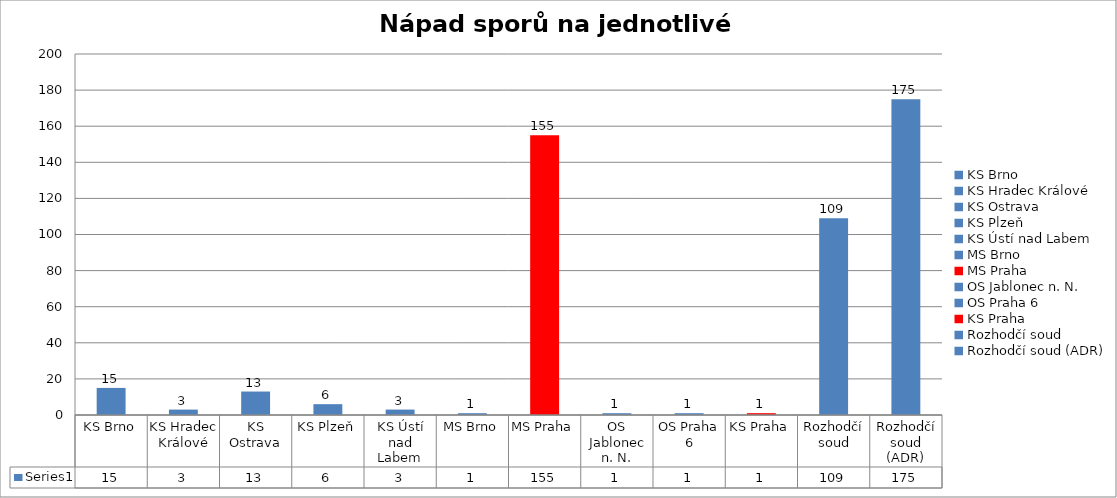
| Category | Series 0 |
|---|---|
| KS Brno | 15 |
| KS Hradec Králové | 3 |
| KS Ostrava | 13 |
| KS Plzeň | 6 |
| KS Ústí nad Labem | 3 |
| MS Brno | 1 |
| MS Praha | 155 |
| OS Jablonec n. N. | 1 |
| OS Praha 6 | 1 |
| KS Praha | 1 |
| Rozhodčí soud | 109 |
| Rozhodčí soud (ADR) | 175 |